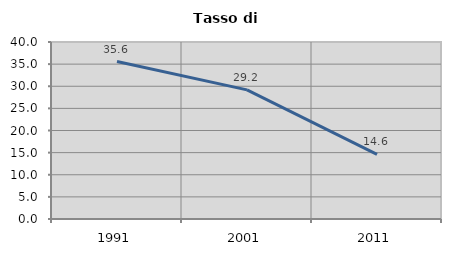
| Category | Tasso di disoccupazione   |
|---|---|
| 1991.0 | 35.593 |
| 2001.0 | 29.176 |
| 2011.0 | 14.612 |